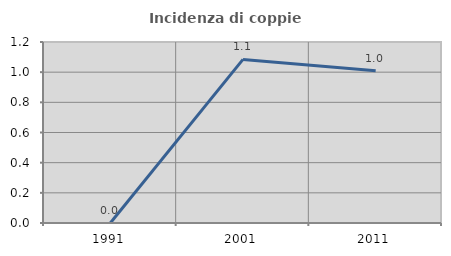
| Category | Incidenza di coppie miste |
|---|---|
| 1991.0 | 0 |
| 2001.0 | 1.085 |
| 2011.0 | 1.01 |